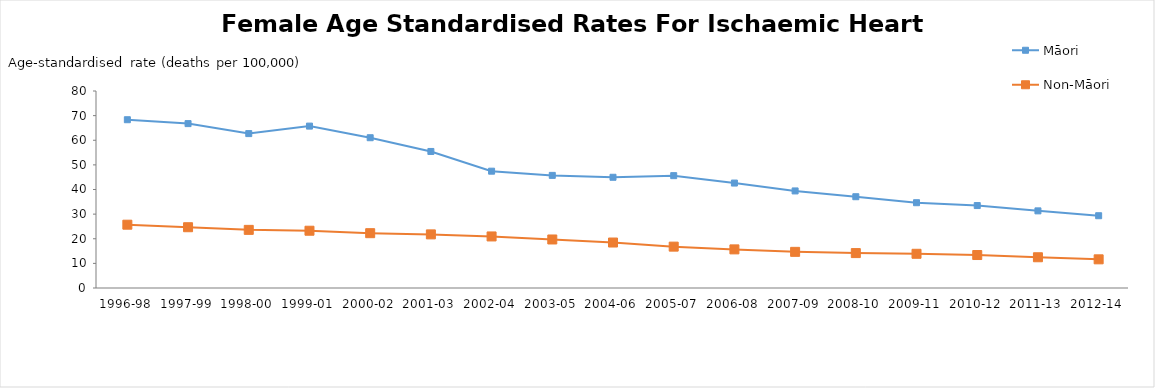
| Category | Māori | Non-Māori |
|---|---|---|
| 1996-98 | 68.333 | 25.705 |
| 1997-99 | 66.757 | 24.682 |
| 1998-00 | 62.699 | 23.61 |
| 1999-01 | 65.747 | 23.256 |
| 2000-02 | 61.025 | 22.265 |
| 2001-03 | 55.444 | 21.771 |
| 2002-04 | 47.439 | 20.935 |
| 2003-05 | 45.733 | 19.702 |
| 2004-06 | 44.967 | 18.466 |
| 2005-07 | 45.624 | 16.796 |
| 2006-08 | 42.617 | 15.682 |
| 2007-09 | 39.422 | 14.678 |
| 2008-10 | 37.063 | 14.18 |
| 2009-11 | 34.637 | 13.895 |
| 2010-12 | 33.48 | 13.391 |
| 2011-13 | 31.323 | 12.484 |
| 2012-14 | 29.351 | 11.643 |